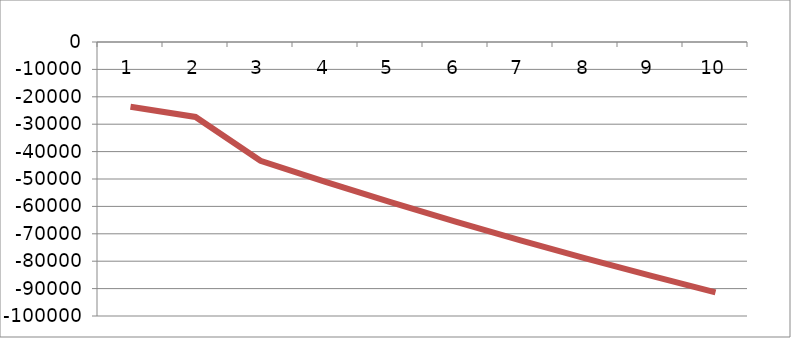
| Category | Series 1 |
|---|---|
| 1.0 | -23636 |
| 2.0 | -27346.577 |
| 3.0 | -43358.658 |
| 4.0 | -51050.254 |
| 5.0 | -58446.02 |
| 6.0 | -65557.333 |
| 7.0 | -72395.135 |
| 8.0 | -78969.944 |
| 9.0 | -85291.875 |
| 10.0 | -91370.656 |